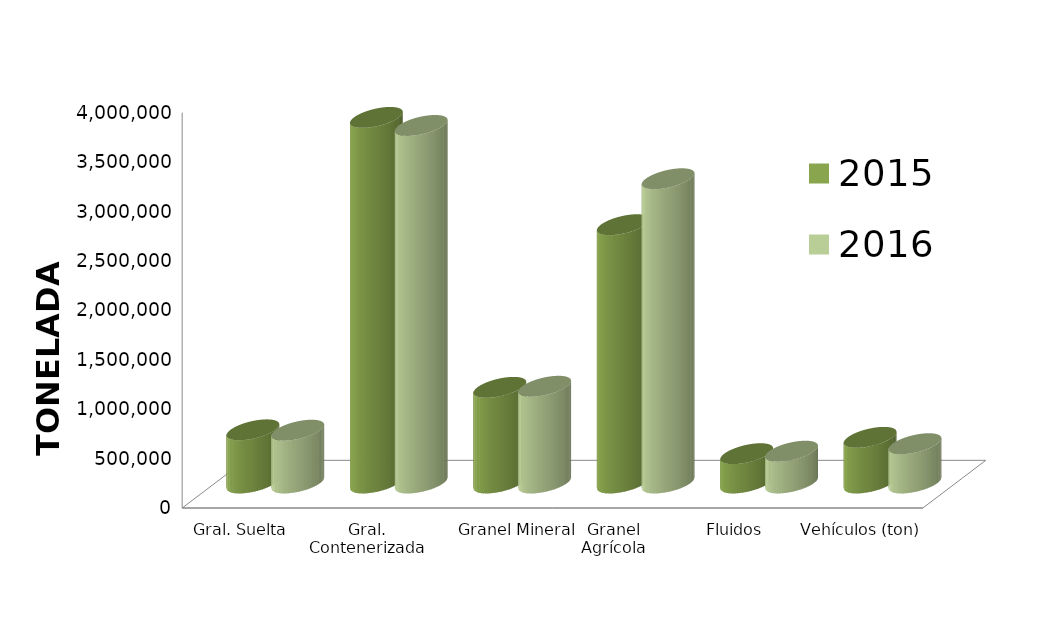
| Category | 2015 | 2016 |
|---|---|---|
| Gral. Suelta | 538062.079 | 534379.542 |
| Gral. Contenerizada | 3699240.702 | 3617736.588 |
| Granel Mineral | 967983.23 | 978900.391 |
| Granel Agrícola | 2613619.685 | 3078560.978 |
| Fluidos | 296624.059 | 321967.831 |
| Vehículos (ton) | 462023.214 | 397738.882 |